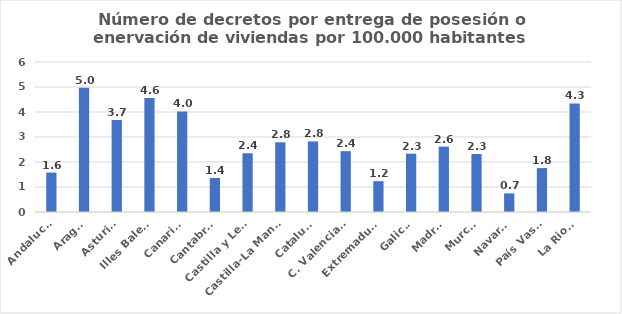
| Category | Numero de decretos por entrega de posesión o enervacion por 100.000 habitantes |
|---|---|
| Andalucía | 1.578 |
| Aragón | 4.965 |
| Asturias | 3.676 |
| Illes Balears | 4.558 |
| Canarias | 4.022 |
| Cantabria | 1.359 |
| Castilla y León | 2.35 |
| Castilla-La Mancha | 2.788 |
| Cataluña | 2.823 |
| C. Valenciana | 2.434 |
| Extremadura | 1.233 |
| Galicia | 2.334 |
| Madrid | 2.614 |
| Murcia | 2.319 |
| Navarra | 0.744 |
| País Vasco | 1.757 |
| La Rioja | 4.344 |